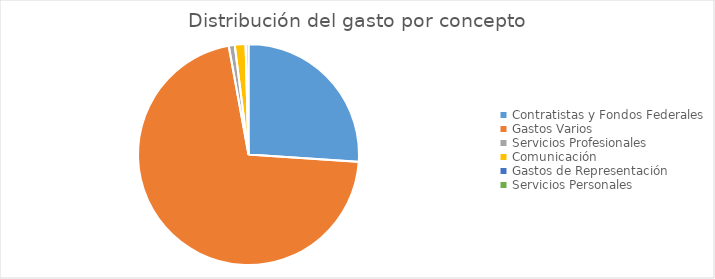
| Category | Series 0 |
|---|---|
| Contratistas y Fondos Federales | 152808619.11 |
| Gastos Varios | 416791319.46 |
| Servicios Profesionales | 5091755.955 |
| Comunicación | 9277535.01 |
| Gastos de Representación | 0 |
| Servicios Personales | 2444367.3 |